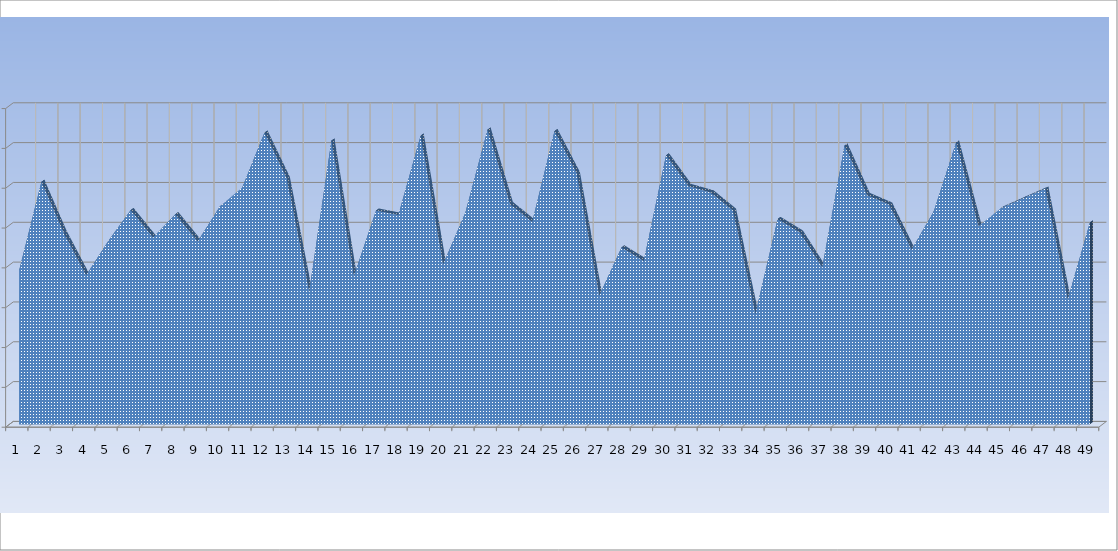
| Category | Series 0 | Series 1 |
|---|---|---|
| 0 | 385.3 |  |
| 1 | 608 |  |
| 2 | 479.3 |  |
| 3 | 373.3 |  |
| 4 | 460.1 |  |
| 5 | 536.8 |  |
| 6 | 468 |  |
| 7 | 526.6 |  |
| 8 | 458.2 |  |
| 9 | 546.7 |  |
| 10 | 593.3 |  |
| 11 | 731.5 |  |
| 12 | 615.4 |  |
| 13 | 330.6 |  |
| 14 | 711.6 |  |
| 15 | 370.7 |  |
| 16 | 535.6 |  |
| 17 | 524.7 |  |
| 18 | 723.8 |  |
| 19 | 400.4 |  |
| 20 | 530 |  |
| 21 | 739.1 |  |
| 22 | 552.2 |  |
| 23 | 506.8 |  |
| 24 | 735.1 |  |
| 25 | 628.2 |  |
| 26 | 321.9 |  |
| 27 | 443.1 |  |
| 28 | 409 |  |
| 29 | 674.3 |  |
| 30 | 597.2 |  |
| 31 | 581.2 |  |
| 32 | 535.5 |  |
| 33 | 275.5 |  |
| 34 | 514.6 |  |
| 35 | 480.5 |  |
| 36 | 392.5 |  |
| 37 | 699 |  |
| 38 | 574.8 |  |
| 39 | 550.9 |  |
| 40 | 437.2 |  |
| 41 | 533.7 |  |
| 42 | 706.2 |  |
| 43 | 496.5 |  |
| 44 | 541.5 |  |
| 45 | 566.3 |  |
| 46 | 591.1 |  |
| 47 | 311.5 |  |
| 48 | 506.2 |  |